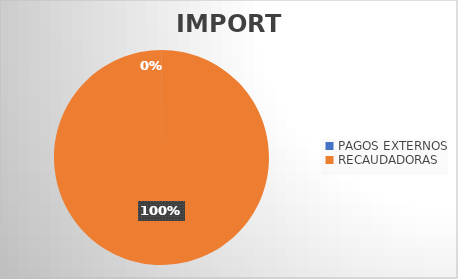
| Category | IMPORTE |
|---|---|
| PAGOS EXTERNOS | 276565.27 |
| RECAUDADORAS | 1491674464.66 |